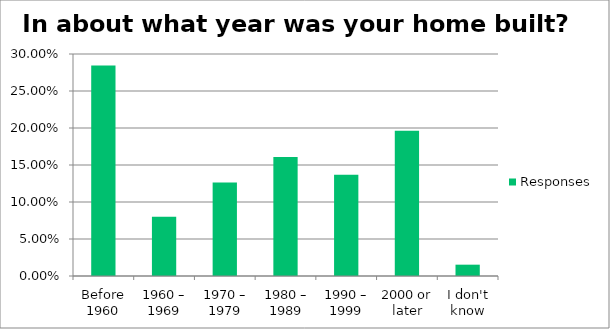
| Category | Responses |
|---|---|
| Before 1960 | 0.284 |
| 1960 – 1969 | 0.08 |
| 1970 – 1979 | 0.126 |
| 1980 – 1989 | 0.161 |
| 1990 – 1999 | 0.137 |
| 2000 or later | 0.196 |
| I don't know | 0.015 |